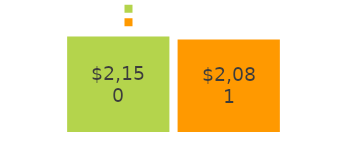
| Category | coming in | going out |
|---|---|---|
| money coming in: | 2150 | 2081 |